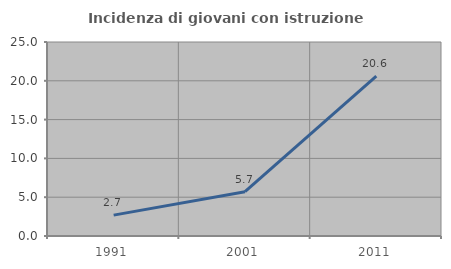
| Category | Incidenza di giovani con istruzione universitaria |
|---|---|
| 1991.0 | 2.692 |
| 2001.0 | 5.714 |
| 2011.0 | 20.606 |